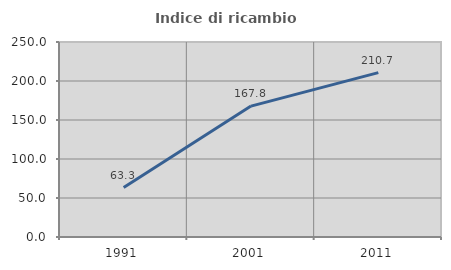
| Category | Indice di ricambio occupazionale  |
|---|---|
| 1991.0 | 63.319 |
| 2001.0 | 167.826 |
| 2011.0 | 210.714 |